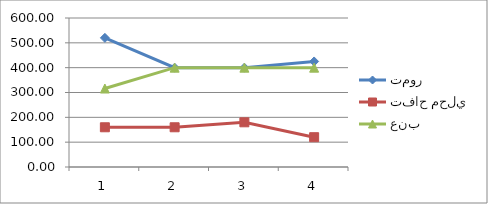
| Category | تمور | تفاح محلي | عنب |
|---|---|---|---|
| 0 | 520 | 160 | 316 |
| 1 | 400 | 160 | 400 |
| 2 | 400 | 180 | 400 |
| 3 | 425 | 120 | 400 |